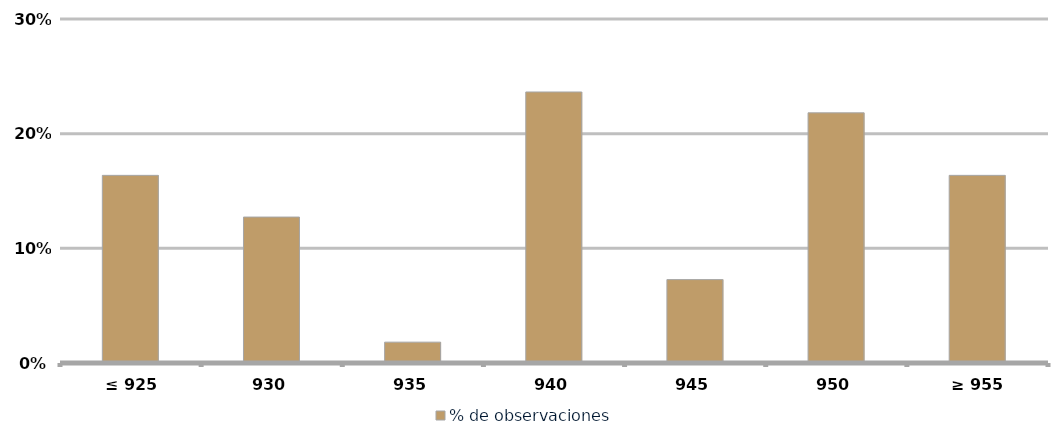
| Category | % de observaciones  |
|---|---|
|  ≤ 925  | 0.164 |
|  930  | 0.127 |
|  935  | 0.018 |
|  940  | 0.236 |
|  945  | 0.073 |
| 950 | 0.218 |
|  ≥ 955  | 0.164 |